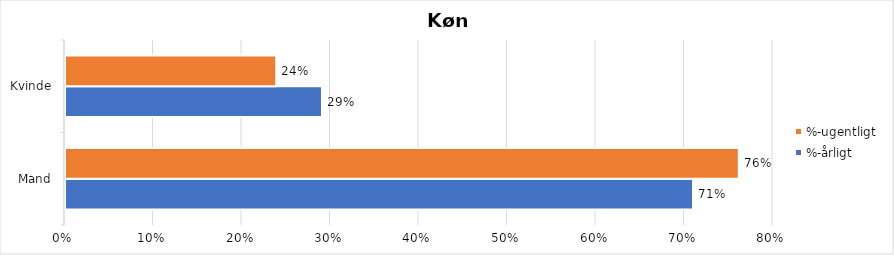
| Category | %-årligt | %-ugentligt |
|---|---|---|
| Mand | 0.71 | 0.761 |
| Kvinde | 0.29 | 0.239 |